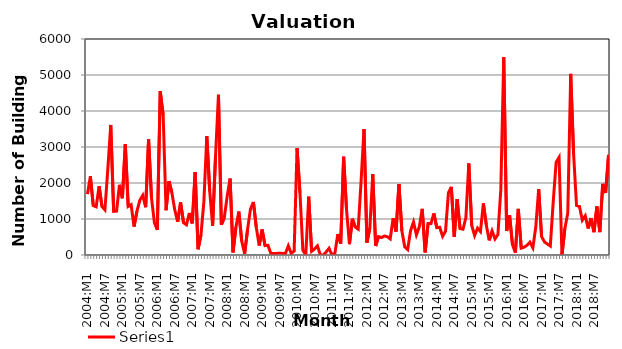
| Category | Series 0 |
|---|---|
| 2004:M1 | 1689.5 |
| 2004:M2 | 2185.5 |
| 2004:M3 | 1372.125 |
| 2004:M4 | 1338.625 |
| 2004:M5 | 1911.5 |
| 2004:M6 | 1344.625 |
| 2004:M7 | 1253 |
| 2004:M8 | 2392.875 |
| 2004:M9 | 3612.5 |
| 2004:M10 | 1214 |
| 2004:M11 | 1221.875 |
| 2004:M12 | 1948.75 |
| 2005:M1 | 1577 |
| 2005:M2 | 3075.625 |
| 2005:M3 | 1349.25 |
| 2005:M4 | 1395.25 |
| 2005:M5 | 789.25 |
| 2005:M6 | 1215.625 |
| 2005:M7 | 1522.25 |
| 2005:M8 | 1656.625 |
| 2005:M9 | 1327 |
| 2005:M10 | 3211.375 |
| 2005:M11 | 1586.5 |
| 2005:M12 | 900.75 |
| 2006:M1 | 697.875 |
| 2006:M2 | 4552.875 |
| 2006:M3 | 3890.75 |
| 2006:M4 | 1242.875 |
| 2006:M5 | 2051.125 |
| 2006:M6 | 1735 |
| 2006:M7 | 1248.875 |
| 2006:M8 | 923.125 |
| 2006:M9 | 1460.625 |
| 2006:M10 | 898.125 |
| 2006:M11 | 839.875 |
| 2006:M12 | 1166.5 |
| 2007:M1 | 878.125 |
| 2007:M2 | 2303.375 |
| 2007:M3 | 159.75 |
| 2007:M4 | 562.75 |
| 2007:M5 | 1488 |
| 2007:M6 | 3304.25 |
| 2007:M7 | 1776.25 |
| 2007:M8 | 813.5 |
| 2007:M9 | 2748.5 |
| 2007:M10 | 4450.25 |
| 2007:M11 | 840.75 |
| 2007:M12 | 1032.875 |
| 2008:M1 | 1633.5 |
| 2008:M2 | 2122.875 |
| 2008:M3 | 71.625 |
| 2008:M4 | 775 |
| 2008:M5 | 1206.5 |
| 2008:M6 | 379 |
| 2008:M7 | 38.125 |
| 2008:M8 | 710.875 |
| 2008:M9 | 1275.75 |
| 2008:M10 | 1473 |
| 2008:M11 | 766 |
| 2008:M12 | 262 |
| 2009:M1 | 709.125 |
| 2009:M2 | 260.875 |
| 2009:M3 | 269 |
| 2009:M4 | 43 |
| 2009:M5 | 43 |
| 2009:M6 | 43 |
| 2009:M7 | 51.625 |
| 2009:M8 | 43 |
| 2009:M9 | 43 |
| 2009:M10 | 254.375 |
| 2009:M11 | 43 |
| 2009:M12 | 111 |
| 2010:M1 | 2968.625 |
| 2010:M2 | 1728 |
| 2010:M3 | 131.875 |
| 2010:M4 | 0 |
| 2010:M5 | 1619.625 |
| 2010:M6 | 102.625 |
| 2010:M7 | 165.625 |
| 2010:M8 | 254.25 |
| 2010:M9 | 0 |
| 2010:M10 | 0 |
| 2010:M11 | 84 |
| 2010:M12 | 186.625 |
| 2011:M1 | 0 |
| 2011:M2 | 46.625 |
| 2011:M3 | 580.625 |
| 2011:M4 | 316.5 |
| 2011:M5 | 2729 |
| 2011:M6 | 1254.5 |
| 2011:M7 | 299.875 |
| 2011:M8 | 1006.25 |
| 2011:M9 | 777.125 |
| 2011:M10 | 716.375 |
| 2011:M11 | 2049.625 |
| 2011:M12 | 3501 |
| 2012:M1 | 344.625 |
| 2012:M2 | 749.75 |
| 2012:M3 | 2249.25 |
| 2012:M4 | 249.875 |
| 2012:M5 | 511 |
| 2012:M6 | 484.125 |
| 2012:M7 | 527.25 |
| 2012:M8 | 507.125 |
| 2012:M9 | 446.875 |
| 2012:M10 | 1020.625 |
| 2012:M11 | 650.25 |
| 2012:M12 | 1972.625 |
| 2013:M1 | 671.625 |
| 2013:M2 | 224.875 |
| 2013:M3 | 151 |
| 2013:M4 | 678.875 |
| 2013:M5 | 915.25 |
| 2013:M6 | 560.25 |
| 2013:M7 | 783 |
| 2013:M8 | 1283.5 |
| 2013:M9 | 71.25 |
| 2013:M10 | 873 |
| 2013:M11 | 871.75 |
| 2013:M12 | 1155 |
| 2014:M1 | 758.375 |
| 2014:M2 | 770.875 |
| 2014:M3 | 519.25 |
| 2014:M4 | 660.5 |
| 2014:M5 | 1726.875 |
| 2014:M6 | 1892.625 |
| 2014:M7 | 505.875 |
| 2014:M8 | 1551.125 |
| 2014:M9 | 733.125 |
| 2014:M10 | 714.75 |
| 2014:M11 | 1040.25 |
| 2014:M12 | 2543 |
| 2015:M1 | 819.286 |
| 2015:M2 | 540.714 |
| 2015:M3 | 747.857 |
| 2015:M4 | 651.714 |
| 2015:M5 | 1435 |
| 2015:M6 | 838.857 |
| 2015:M7 | 406.857 |
| 2015:M8 | 666.714 |
| 2015:M9 | 446.143 |
| 2015:M10 | 567.429 |
| 2015:M11 | 1829.286 |
| 2015:M12 | 5492.571 |
| 2016:M1 | 666.714 |
| 2016:M2 | 1105.571 |
| 2016:M3 | 288.714 |
| 2016:M4 | 65.571 |
| 2016:M5 | 1280.143 |
| 2016:M6 | 191.857 |
| 2016:M7 | 217.429 |
| 2016:M8 | 270.143 |
| 2016:M9 | 356.143 |
| 2016:M10 | 200.429 |
| 2016:M11 | 773.286 |
| 2016:M12 | 1830.286 |
| 2017:M1 | 511.429 |
| 2017:M2 | 361.714 |
| 2017:M3 | 307.286 |
| 2017:M4 | 251.857 |
| 2017:M5 | 1483.286 |
| 2017:M6 | 2576 |
| 2017:M7 | 2711.286 |
| 2017:M8 | 0 |
| 2017:M9 | 738 |
| 2017:M10 | 1164.714 |
| 2017:M11 | 5031 |
| 2017:M12 | 2799 |
| 2018:M1 | 1375.714 |
| 2018:M2 | 1347.286 |
| 2018:M3 | 964.429 |
| 2018:M4 | 1087.857 |
| 2018:M5 | 735.429 |
| 2018:M6 | 1024.286 |
| 2018:M7 | 634.429 |
| 2018:M8 | 1349.571 |
| 2018:M9 | 636.429 |
| 2018:M10 | 1974 |
| 2018:M11 | 1722.571 |
| 2018:M12 | 2779.429 |